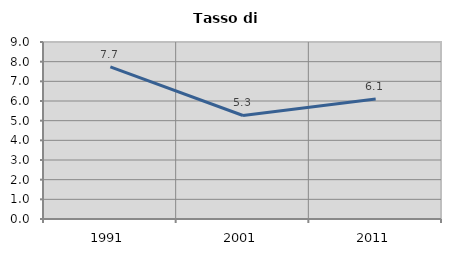
| Category | Tasso di disoccupazione   |
|---|---|
| 1991.0 | 7.739 |
| 2001.0 | 5.263 |
| 2011.0 | 6.102 |